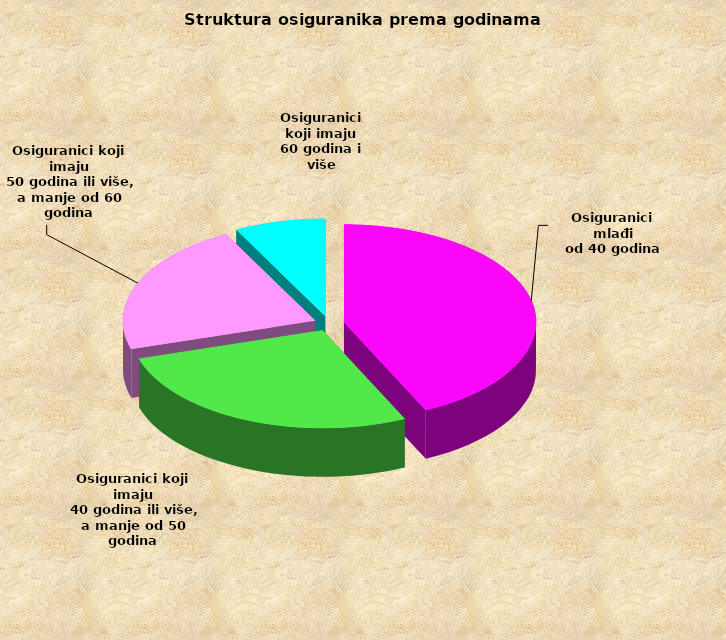
| Category | Series 0 |
|---|---|
| Osiguranici mlađi
od 40 godina | 696866 |
| Osiguranici koji imaju
 40 godina ili više, a manje od 50 godina | 442419 |
| Osiguranici koji imaju
 50 godina ili više, a manje od 60 godina | 357189 |
| Osiguranici koji imaju
60 godina i više | 124317 |